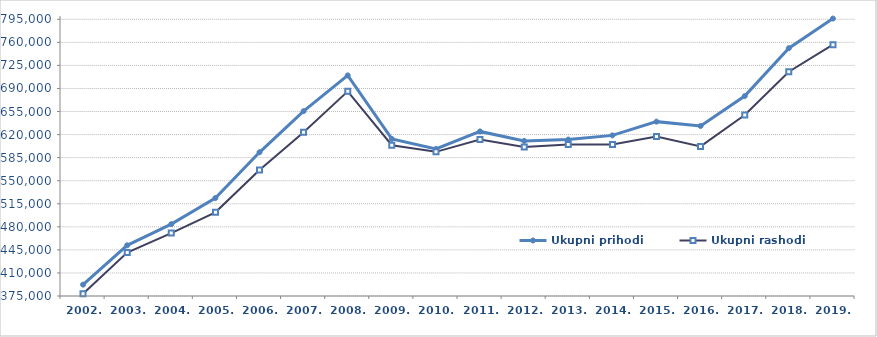
| Category | Ukupni prihodi | Ukupni rashodi |
|---|---|---|
| 2002. | 392243 | 378256 |
| 2003. | 451948.048 | 440959.172 |
| 2004. | 484078.57 | 470476.963 |
| 2005. | 523712.497 | 502004.976 |
| 2006. | 593140.267 | 566387.326 |
| 2007. | 655560.537 | 623617.647 |
| 2008. | 709827 | 685638 |
| 2009. | 613367 | 603876 |
| 2010. | 598187 | 593810 |
| 2011. | 624807 | 612393 |
| 2012. | 610376 | 601183 |
| 2013. | 612441 | 604998 |
| 2014. | 618791 | 604884 |
| 2015. | 639647.947 | 616954.49 |
| 2016. | 633109.425 | 602063.828 |
| 2017. | 678395 | 649769 |
| 2018. | 751159.626 | 715419.857 |
| 2019. | 796126.335 | 756495.954 |